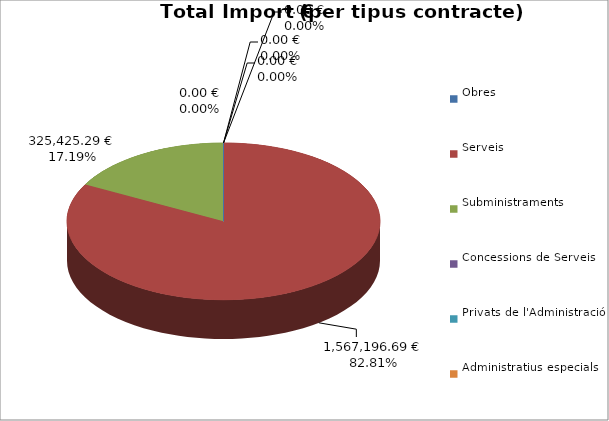
| Category | Total preu
(amb IVA) |
|---|---|
| Obres | 0 |
| Serveis | 1567196.69 |
| Subministraments | 325425.29 |
| Concessions de Serveis | 0 |
| Privats de l'Administració | 0 |
| Administratius especials | 0 |